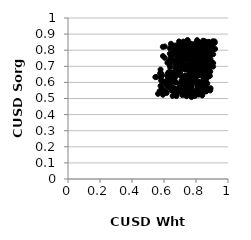
| Category | Series 0 |
|---|---|
| 0.8606674296195633 | 0.546 |
| 0.6999348493348481 | 0.582 |
| 0.7616677487825909 | 0.657 |
| 0.8411690088886075 | 0.675 |
| 0.8267198958037669 | 0.713 |
| 0.6464275884863512 | 0.551 |
| 0.6991743480333439 | 0.749 |
| 0.9055763534838281 | 0.842 |
| 0.6305321046207775 | 0.724 |
| 0.7493462155051412 | 0.794 |
| 0.7926615514258134 | 0.693 |
| 0.8619842693842257 | 0.784 |
| 0.8018020450109519 | 0.812 |
| 0.7681431878229723 | 0.658 |
| 0.7435577358216263 | 0.769 |
| 0.7680098271674152 | 0.641 |
| 0.8462123624348579 | 0.728 |
| 0.7551497769042917 | 0.774 |
| 0.8528021611921892 | 0.669 |
| 0.7980126099627312 | 0.739 |
| 0.7474657759232011 | 0.69 |
| 0.8227832912499451 | 0.732 |
| 0.7874615999468071 | 0.825 |
| 0.6772578194846646 | 0.515 |
| 0.8738030863500944 | 0.564 |
| 0.8219093014470423 | 0.804 |
| 0.7866721516052269 | 0.748 |
| 0.6597053665394986 | 0.566 |
| 0.6516592689620344 | 0.55 |
| 0.7657209606896632 | 0.712 |
| 0.8024218543053964 | 0.706 |
| 0.8706550780828108 | 0.594 |
| 0.669074520028345 | 0.829 |
| 0.8646617876156557 | 0.557 |
| 0.7603945457837402 | 0.714 |
| 0.6247156605005162 | 0.658 |
| 0.8823604310153959 | 0.64 |
| 0.6760753035382701 | 0.693 |
| 0.7093660823693577 | 0.761 |
| 0.8226724688563778 | 0.558 |
| 0.7941110131641931 | 0.539 |
| 0.7574359576495027 | 0.774 |
| 0.828742201009635 | 0.722 |
| 0.7875686067217196 | 0.546 |
| 0.7559894152250648 | 0.782 |
| 0.7127020296447344 | 0.815 |
| 0.8891551870113985 | 0.55 |
| 0.762055454840781 | 0.578 |
| 0.8590485811385213 | 0.818 |
| 0.7184461397085107 | 0.737 |
| 0.863336542518994 | 0.6 |
| 0.7287862776569984 | 0.823 |
| 0.7763459543036225 | 0.542 |
| 0.8511013413340252 | 0.82 |
| 0.7853879393883064 | 0.743 |
| 0.7261053649565652 | 0.803 |
| 0.8073128500880817 | 0.732 |
| 0.7706152322490856 | 0.823 |
| 0.8549010762931147 | 0.556 |
| 0.8164788701928894 | 0.762 |
| 0.7282324067350684 | 0.622 |
| 0.8453413548928314 | 0.64 |
| 0.7408618150149606 | 0.831 |
| 0.5826546042844745 | 0.613 |
| 0.5849590476056439 | 0.61 |
| 0.834208086383052 | 0.572 |
| 0.8829216560381401 | 0.821 |
| 0.7619245457397941 | 0.655 |
| 0.7424667995521614 | 0.591 |
| 0.63430194592752 | 0.602 |
| 0.8665952181532147 | 0.704 |
| 0.6363046175230376 | 0.778 |
| 0.8123294542023353 | 0.59 |
| 0.6272517796509438 | 0.613 |
| 0.7303868740352525 | 0.681 |
| 0.747805615586763 | 0.535 |
| 0.7387196085404604 | 0.705 |
| 0.8531141233221653 | 0.856 |
| 0.7000441003576795 | 0.811 |
| 0.7357308003392908 | 0.77 |
| 0.6686884077655872 | 0.735 |
| 0.886459890604691 | 0.822 |
| 0.7967532162745362 | 0.809 |
| 0.713061950828129 | 0.756 |
| 0.8450386710320554 | 0.72 |
| 0.650107749832884 | 0.603 |
| 0.8830811718809208 | 0.65 |
| 0.6908439687992156 | 0.829 |
| 0.7494634234757541 | 0.635 |
| 0.7966015069082593 | 0.811 |
| 0.6525941603431751 | 0.609 |
| 0.8988485349186075 | 0.806 |
| 0.7642685110995725 | 0.841 |
| 0.8048900127626286 | 0.595 |
| 0.7773979851258961 | 0.835 |
| 0.9141915747024514 | 0.847 |
| 0.6805559746553618 | 0.529 |
| 0.7753563499236906 | 0.836 |
| 0.7313395420374461 | 0.789 |
| 0.7403778849098179 | 0.696 |
| 0.6369871910606489 | 0.705 |
| 0.794139560420247 | 0.687 |
| 0.5459135540867835 | 0.633 |
| 0.8891057101044171 | 0.667 |
| 0.8570862290025462 | 0.772 |
| 0.8404834262172327 | 0.586 |
| 0.8190058497395645 | 0.599 |
| 0.7832564238110448 | 0.669 |
| 0.7670144380952288 | 0.706 |
| 0.6049131091752462 | 0.823 |
| 0.8841599138822888 | 0.799 |
| 0.769766131755828 | 0.679 |
| 0.7914323824373495 | 0.61 |
| 0.8394290192869471 | 0.707 |
| 0.900254879935451 | 0.788 |
| 0.7705790342479129 | 0.607 |
| 0.5785080369647733 | 0.68 |
| 0.7730563596486816 | 0.806 |
| 0.7109604963369003 | 0.594 |
| 0.7114264282506166 | 0.706 |
| 0.7945318887647026 | 0.517 |
| 0.7047854540880232 | 0.768 |
| 0.7987490666397192 | 0.83 |
| 0.657621811892098 | 0.736 |
| 0.7972365121890362 | 0.636 |
| 0.8160670857000676 | 0.6 |
| 0.8172476007302536 | 0.661 |
| 0.8645980398335521 | 0.544 |
| 0.6465674440631175 | 0.825 |
| 0.6473330996554859 | 0.634 |
| 0.69388869733561 | 0.854 |
| 0.822845698345114 | 0.801 |
| 0.6835287564256733 | 0.702 |
| 0.7262040441602107 | 0.597 |
| 0.7393463433897386 | 0.809 |
| 0.7431892750957874 | 0.775 |
| 0.7576750658893622 | 0.77 |
| 0.8205171400303991 | 0.602 |
| 0.8955819652153647 | 0.729 |
| 0.8456059353965881 | 0.733 |
| 0.8621538082955802 | 0.852 |
| 0.8574976041245859 | 0.744 |
| 0.7011321767333416 | 0.659 |
| 0.727032698446707 | 0.607 |
| 0.8115324630853016 | 0.73 |
| 0.7130231030299599 | 0.532 |
| 0.9100789554782126 | 0.85 |
| 0.8610060682945005 | 0.704 |
| 0.6461637803023965 | 0.628 |
| 0.5815749823376429 | 0.631 |
| 0.7684164012723802 | 0.792 |
| 0.57873007427408 | 0.578 |
| 0.6897111563245267 | 0.833 |
| 0.791592401936394 | 0.716 |
| 0.6381668285140478 | 0.694 |
| 0.7902167455943879 | 0.814 |
| 0.8214099296545454 | 0.753 |
| 0.841845915618669 | 0.729 |
| 0.8655235738521514 | 0.698 |
| 0.8470280653277532 | 0.655 |
| 0.6705704897241429 | 0.53 |
| 0.7714581741482851 | 0.569 |
| 0.6950713011940342 | 0.792 |
| 0.7634400294237285 | 0.782 |
| 0.8624804471045378 | 0.824 |
| 0.552539735679884 | 0.634 |
| 0.6047432097485013 | 0.538 |
| 0.8455813681659083 | 0.723 |
| 0.643227611150495 | 0.84 |
| 0.8653294060950341 | 0.622 |
| 0.7461143308959663 | 0.757 |
| 0.7656652444362569 | 0.562 |
| 0.846718511545769 | 0.622 |
| 0.7617597047274746 | 0.789 |
| 0.7111814085209395 | 0.709 |
| 0.8520275885324056 | 0.73 |
| 0.7711167658126614 | 0.52 |
| 0.6589163452898665 | 0.663 |
| 0.8876979161435098 | 0.701 |
| 0.7415588676593998 | 0.739 |
| 0.638925142293215 | 0.618 |
| 0.842803687995572 | 0.568 |
| 0.5927702129927285 | 0.821 |
| 0.8888104122212008 | 0.813 |
| 0.7506243877987404 | 0.799 |
| 0.8258061881006242 | 0.786 |
| 0.7126045932211109 | 0.593 |
| 0.8164320188498746 | 0.525 |
| 0.8816331317544839 | 0.85 |
| 0.7605180500470761 | 0.717 |
| 0.7689107483400326 | 0.593 |
| 0.5840231444493837 | 0.654 |
| 0.6778154042169096 | 0.744 |
| 0.7299447843663049 | 0.606 |
| 0.7433305532417129 | 0.823 |
| 0.6364237006245839 | 0.812 |
| 0.6215099641155544 | 0.639 |
| 0.6720542953454912 | 0.688 |
| 0.7782598846361921 | 0.793 |
| 0.8689872887404752 | 0.694 |
| 0.6974467133722992 | 0.735 |
| 0.6394360754973103 | 0.646 |
| 0.8635625449101264 | 0.68 |
| 0.810560085752624 | 0.722 |
| 0.8016937719703552 | 0.693 |
| 0.6568893812398542 | 0.637 |
| 0.7407771515292378 | 0.514 |
| 0.5760868745589425 | 0.658 |
| 0.8873434219742073 | 0.762 |
| 0.6512638997739032 | 0.651 |
| 0.6652056943328782 | 0.816 |
| 0.6767092164983124 | 0.71 |
| 0.8756846499300529 | 0.734 |
| 0.8209297307973322 | 0.781 |
| 0.8008426721371884 | 0.691 |
| 0.8641630802995725 | 0.665 |
| 0.771986340988601 | 0.509 |
| 0.7552100750282434 | 0.536 |
| 0.7126084199542722 | 0.75 |
| 0.8496559043590572 | 0.767 |
| 0.5934084951309078 | 0.764 |
| 0.8584434143177334 | 0.674 |
| 0.7466401838204122 | 0.677 |
| 0.8389305771052886 | 0.519 |
| 0.6411942763267084 | 0.587 |
| 0.8732103970196142 | 0.696 |
| 0.8233443501146176 | 0.583 |
| 0.5971302854120267 | 0.603 |
| 0.6420376646838131 | 0.573 |
| 0.827682074088159 | 0.786 |
| 0.7012180453999416 | 0.795 |
| 0.6882295356850916 | 0.763 |
| 0.6162200985139986 | 0.534 |
| 0.7931456751874846 | 0.639 |
| 0.6272098400817191 | 0.621 |
| 0.8351566433848229 | 0.705 |
| 0.6540176816289807 | 0.785 |
| 0.8536086110617027 | 0.797 |
| 0.8827212616734962 | 0.773 |
| 0.7895378014868231 | 0.771 |
| 0.8160166289097711 | 0.728 |
| 0.8732998928667913 | 0.673 |
| 0.8114623580518086 | 0.749 |
| 0.6050389218129978 | 0.599 |
| 0.6432901844368986 | 0.614 |
| 0.7687681902367982 | 0.573 |
| 0.7146784816566172 | 0.781 |
| 0.617539525077824 | 0.613 |
| 0.8188739694740013 | 0.554 |
| 0.6434206310784697 | 0.759 |
| 0.7919602599321796 | 0.769 |
| 0.6331478008929023 | 0.615 |
| 0.8189360760480737 | 0.565 |
| 0.6637279790685899 | 0.815 |
| 0.7519100591954112 | 0.76 |
| 0.6808461745985499 | 0.802 |
| 0.8506954751676822 | 0.751 |
| 0.7158261729020052 | 0.848 |
| 0.8812523412218833 | 0.838 |
| 0.8160749519391077 | 0.79 |
| 0.7884967793261731 | 0.806 |
| 0.8109143930961263 | 0.757 |
| 0.8181013925329039 | 0.795 |
| 0.8621398829910908 | 0.656 |
| 0.6970379652420732 | 0.737 |
| 0.7190223024847787 | 0.563 |
| 0.8428332807702796 | 0.638 |
| 0.8432223522655187 | 0.535 |
| 0.8367260831390656 | 0.843 |
| 0.8504165880620544 | 0.615 |
| 0.8012370942996936 | 0.849 |
| 0.738294205019498 | 0.539 |
| 0.8408728543970745 | 0.786 |
| 0.6913028649901257 | 0.548 |
| 0.8579816799352373 | 0.828 |
| 0.6670168252955941 | 0.626 |
| 0.8399845630766394 | 0.582 |
| 0.8861856365076313 | 0.639 |
| 0.6882287428264124 | 0.742 |
| 0.7261095750426819 | 0.635 |
| 0.7459321257994539 | 0.621 |
| 0.6970139019152364 | 0.816 |
| 0.7373628606863207 | 0.705 |
| 0.88455626767976 | 0.818 |
| 0.7836164829181484 | 0.686 |
| 0.6478032502909709 | 0.573 |
| 0.8124582857779081 | 0.748 |
| 0.8676851310975964 | 0.703 |
| 0.8123425496476344 | 0.535 |
| 0.754673587195449 | 0.839 |
| 0.6343893063387842 | 0.735 |
| 0.8414378532127648 | 0.723 |
| 0.8302352892545374 | 0.785 |
| 0.7100712161584233 | 0.607 |
| 0.7796773033210417 | 0.719 |
| 0.7695225444960228 | 0.752 |
| 0.7306427456611819 | 0.756 |
| 0.8003189563681707 | 0.748 |
| 0.907408295325438 | 0.72 |
| 0.6256235291805492 | 0.577 |
| 0.8162489379057041 | 0.789 |
| 0.8254555309737044 | 0.705 |
| 0.8616560084394712 | 0.648 |
| 0.6956451369858517 | 0.822 |
| 0.6212432720647237 | 0.722 |
| 0.720477365442941 | 0.588 |
| 0.7855729514309479 | 0.627 |
| 0.7637636017744206 | 0.789 |
| 0.7814882263432091 | 0.739 |
| 0.7459905355448025 | 0.861 |
| 0.7358517985887805 | 0.547 |
| 0.7688238770647915 | 0.733 |
| 0.842272771584692 | 0.688 |
| 0.7302664166692087 | 0.686 |
| 0.8461545169753178 | 0.707 |
| 0.844170841511323 | 0.752 |
| 0.8558165645070729 | 0.595 |
| 0.6756918324898885 | 0.648 |
| 0.8793673836888554 | 0.852 |
| 0.6697015563728509 | 0.822 |
| 0.7373575613773131 | 0.632 |
| 0.7338297327523413 | 0.55 |
| 0.691371620526104 | 0.809 |
| 0.8074120999186758 | 0.713 |
| 0.8077988816557793 | 0.578 |
| 0.7095622871951144 | 0.613 |
| 0.5728358254917891 | 0.546 |
| 0.7044281247054887 | 0.742 |
| 0.7824979367259741 | 0.728 |
| 0.8358422573948905 | 0.756 |
| 0.8836147786046735 | 0.685 |
| 0.7482022941452053 | 0.862 |
| 0.7623057017008482 | 0.829 |
| 0.8225426360062331 | 0.686 |
| 0.5930507305441419 | 0.523 |
| 0.7599118574750922 | 0.838 |
| 0.6308427904724045 | 0.664 |
| 0.7845202420389474 | 0.752 |
| 0.9053722029688596 | 0.855 |
| 0.6418973694429907 | 0.562 |
| 0.6100719539650808 | 0.549 |
| 0.7513478799309836 | 0.588 |
| 0.6933517373490123 | 0.672 |
| 0.7376611831939885 | 0.688 |
| 0.7434453143042599 | 0.807 |
| 0.7204320791972769 | 0.779 |
| 0.8066670010785599 | 0.653 |
| 0.6434577743966531 | 0.732 |
| 0.6980150477723515 | 0.844 |
| 0.744905515403242 | 0.803 |
| 0.7880729395410742 | 0.773 |
| 0.7361378238014964 | 0.595 |
| 0.8360929218424951 | 0.845 |
| 0.6484453032848716 | 0.656 |
| 0.8866137057355947 | 0.795 |
| 0.8019331473024236 | 0.777 |
| 0.6650036045078405 | 0.804 |
| 0.6962325599154053 | 0.782 |
| 0.7928297448203554 | 0.521 |
| 0.7898124238405653 | 0.698 |
| 0.8822482747321022 | 0.824 |
| 0.8028730310165905 | 0.761 |
| 0.658191332485484 | 0.773 |
| 0.7047466177103434 | 0.836 |
| 0.7480536045886679 | 0.695 |
| 0.715517951827609 | 0.723 |
| 0.5947877311453806 | 0.543 |
| 0.6858024636704033 | 0.546 |
| 0.7136596140645739 | 0.827 |
| 0.7961207807155652 | 0.789 |
| 0.8444600061460612 | 0.805 |
| 0.8743394994264134 | 0.71 |
| 0.7446216024779657 | 0.833 |
| 0.7099891387505436 | 0.637 |
| 0.9069599333466056 | 0.698 |
| 0.836795488901021 | 0.6 |
| 0.7525174033381757 | 0.595 |
| 0.7510028570557167 | 0.795 |
| 0.7193258204121296 | 0.604 |
| 0.6541839868776258 | 0.516 |
| 0.872896986666136 | 0.764 |
| 0.8433581901337426 | 0.681 |
| 0.833323076782873 | 0.564 |
| 0.6751179676581265 | 0.599 |
| 0.8483396610296318 | 0.844 |
| 0.8437210322174159 | 0.828 |
| 0.9012390827462435 | 0.832 |
| 0.8585504949483894 | 0.773 |
| 0.8510120033335822 | 0.573 |
| 0.9194648370120022 | 0.808 |
| 0.8474053975248491 | 0.813 |
| 0.8456537909505505 | 0.661 |
| 0.8771244551785382 | 0.767 |
| 0.8381008172166687 | 0.733 |
| 0.7406125934618681 | 0.689 |
| 0.7928154490153846 | 0.626 |
| 0.8209800229967568 | 0.683 |
| 0.6403085808956992 | 0.723 |
| 0.7827902294649498 | 0.515 |
| 0.7598837539863926 | 0.805 |
| 0.8518240353415665 | 0.624 |
| 0.8639974517395514 | 0.658 |
| 0.7330760248281251 | 0.8 |
| 0.8110676950247908 | 0.821 |
| 0.7776440490762082 | 0.669 |
| 0.887156787991738 | 0.718 |
| 0.7192929396571459 | 0.842 |
| 0.7769802574483803 | 0.748 |
| 0.7972150962828148 | 0.797 |
| 0.7143906212037885 | 0.521 |
| 0.7648619522165659 | 0.569 |
| 0.7048843219547547 | 0.768 |
| 0.588480018183968 | 0.644 |
| 0.7954755921440668 | 0.634 |
| 0.8320142247372411 | 0.821 |
| 0.8070732064053938 | 0.863 |
| 0.8154648838161828 | 0.603 |
| 0.9168791066861814 | 0.846 |
| 0.8454649617052246 | 0.758 |
| 0.7266859913749804 | 0.684 |
| 0.7900644041797736 | 0.674 |
| 0.6706492969897138 | 0.539 |
| 0.7255200053472541 | 0.569 |
| 0.7894816522489216 | 0.722 |
| 0.7429976671749301 | 0.565 |
| 0.5870163637829766 | 0.564 |
| 0.7720208843058256 | 0.764 |
| 0.6624426611995167 | 0.607 |
| 0.8728043854501029 | 0.686 |
| 0.7025828976432815 | 0.679 |
| 0.8609967691228757 | 0.566 |
| 0.6429583677941685 | 0.663 |
| 0.7416127455879985 | 0.826 |
| 0.7530693315505331 | 0.599 |
| 0.8442991067638911 | 0.799 |
| 0.8372617934690381 | 0.646 |
| 0.6933276740843215 | 0.82 |
| 0.8058727729384143 | 0.809 |
| 0.6703814946113574 | 0.561 |
| 0.7213331623919413 | 0.853 |
| 0.8910280880502676 | 0.564 |
| 0.6411084712254504 | 0.645 |
| 0.8143298448394103 | 0.851 |
| 0.7194363556164171 | 0.848 |
| 0.6138185248696718 | 0.583 |
| 0.7387586893795919 | 0.814 |
| 0.8442049988724978 | 0.859 |
| 0.6968606523427461 | 0.566 |
| 0.7181515564083577 | 0.809 |
| 0.7070734164161767 | 0.692 |
| 0.6718680601866465 | 0.714 |
| 0.771853121932835 | 0.587 |
| 0.5626353920811603 | 0.529 |
| 0.6658955000600157 | 0.553 |
| 0.9075158176961985 | 0.775 |
| 0.6385023435321047 | 0.607 |
| 0.8131902977208034 | 0.821 |
| 0.7691106939562756 | 0.672 |
| 0.6987520512703356 | 0.734 |
| 0.7505278971956673 | 0.796 |
| 0.8474921745575865 | 0.824 |
| 0.8355750631343921 | 0.766 |
| 0.8133706491991705 | 0.795 |
| 0.7797402582255332 | 0.617 |
| 0.8616905165206683 | 0.567 |
| 0.8347440914619624 | 0.751 |
| 0.9161142594718537 | 0.855 |
| 0.781087082239773 | 0.669 |
| 0.8326654531886902 | 0.828 |
| 0.749211119185095 | 0.627 |
| 0.7324775383770947 | 0.643 |
| 0.845114418180007 | 0.639 |
| 0.8674768130904551 | 0.682 |
| 0.8825468005825443 | 0.834 |
| 0.697797758133453 | 0.589 |
| 0.8707045738688799 | 0.635 |
| 0.6849056354397289 | 0.804 |
| 0.8386834437142767 | 0.826 |
| 0.6848424068489334 | 0.714 |
| 0.8091697740681953 | 0.562 |
| 0.7415007348585687 | 0.521 |
| 0.7980468678304317 | 0.744 |
| 0.7151596529411938 | 0.836 |
| 0.8161887267536658 | 0.644 |
| 0.8448166552464678 | 0.844 |
| 0.7118552771083579 | 0.836 |
| 0.894736558725845 | 0.816 |
| 0.8938141572880075 | 0.776 |
| 0.7635390377683873 | 0.75 |
| 0.6331560485504961 | 0.736 |
| 0.6985566285213716 | 0.751 |
| 0.6766555498901607 | 0.771 |
| 0.8908530128783441 | 0.742 |
| 0.8074035565970805 | 0.64 |
| 0.6049050308760262 | 0.752 |
| 0.6784215488501559 | 0.652 |
| 0.814353950755379 | 0.643 |
| 0.6848092788462434 | 0.647 |
| 0.9031988923091763 | 0.836 |
| 0.7848701350929661 | 0.689 |